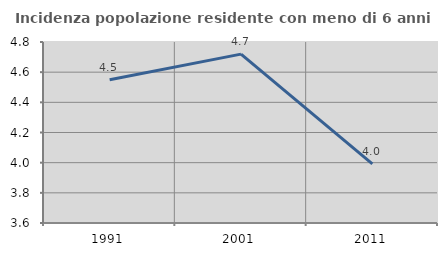
| Category | Incidenza popolazione residente con meno di 6 anni |
|---|---|
| 1991.0 | 4.549 |
| 2001.0 | 4.72 |
| 2011.0 | 3.992 |